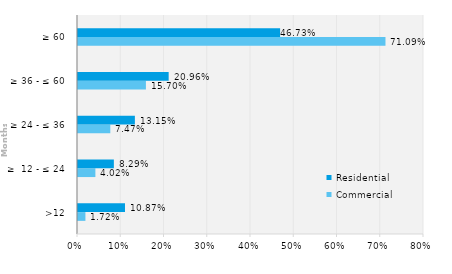
| Category | Commercial | Residential |
|---|---|---|
| >12 | 0.017 | 0.109 |
| ≥  12 - ≤ 24 | 0.04 | 0.083 |
| ≥ 24 - ≤ 36 | 0.075 | 0.132 |
| ≥ 36 - ≤ 60 | 0.157 | 0.21 |
| ≥ 60 | 0.711 | 0.467 |